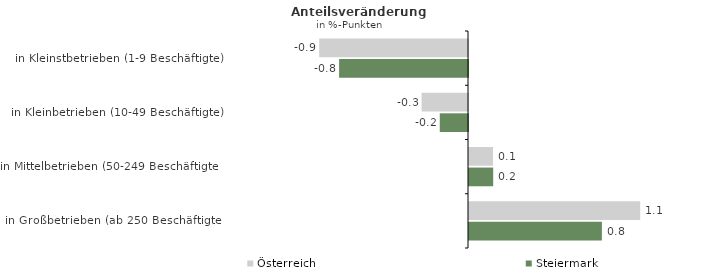
| Category | Österreich | Steiermark |
|---|---|---|
| in Kleinstbetrieben (1-9 Beschäftigte) | -0.926 | -0.802 |
| in Kleinbetrieben (10-49 Beschäftigte) | -0.289 | -0.176 |
| in Mittelbetrieben (50-249 Beschäftigte) | 0.149 | 0.151 |
| in Großbetrieben (ab 250 Beschäftigte) | 1.066 | 0.827 |